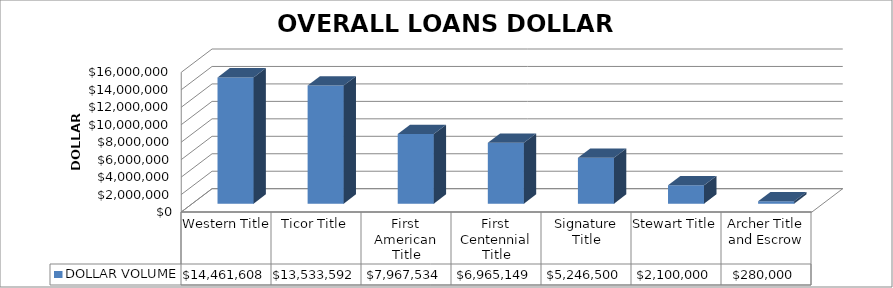
| Category | DOLLAR VOLUME |
|---|---|
| Western Title | 14461608 |
| Ticor Title | 13533592 |
| First American Title | 7967534 |
| First Centennial Title | 6965149 |
| Signature Title | 5246500 |
| Stewart Title | 2100000 |
| Archer Title and Escrow | 280000 |